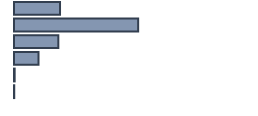
| Category | Percentatge |
|---|---|
| 0 | 19.175 |
| 1 | 51.733 |
| 2 | 18.469 |
| 3 | 10.248 |
| 4 | 0.275 |
| 5 | 0.1 |